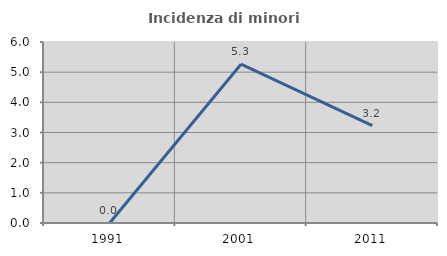
| Category | Incidenza di minori stranieri |
|---|---|
| 1991.0 | 0 |
| 2001.0 | 5.263 |
| 2011.0 | 3.226 |